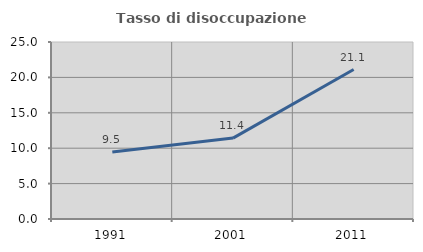
| Category | Tasso di disoccupazione giovanile  |
|---|---|
| 1991.0 | 9.474 |
| 2001.0 | 11.429 |
| 2011.0 | 21.111 |